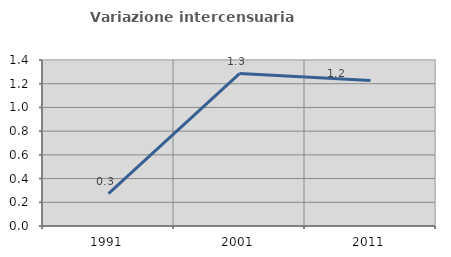
| Category | Variazione intercensuaria annua |
|---|---|
| 1991.0 | 0.273 |
| 2001.0 | 1.286 |
| 2011.0 | 1.227 |